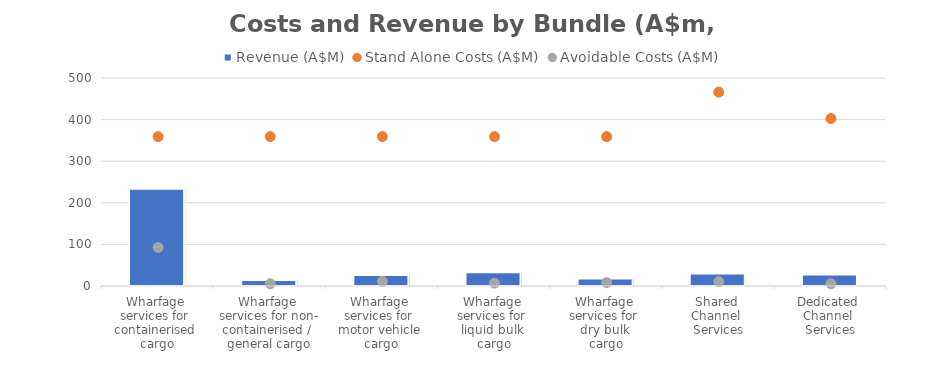
| Category |  Revenue (A$M)  |
|---|---|
| Wharfage 
services for 
containerised 
cargo | 233.6 |
| Wharfage 
services for non-
containerised / 
general cargo | 14.531 |
| Wharfage 
services for 
motor vehicle 
cargo | 26.262 |
| Wharfage 
services for 
liquid bulk 
cargo | 33.086 |
| Wharfage 
services for 
dry bulk 
cargo | 18.025 |
| Shared 
Channel 
Services | 30.046 |
| Dedicated 
Channel 
Services | 27.656 |